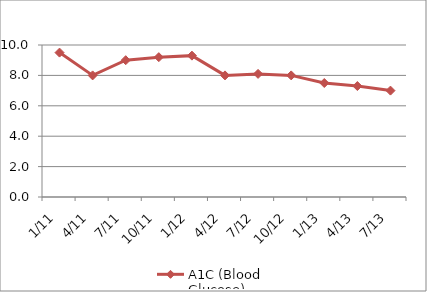
| Category | A1C (Blood Glucose) |
|---|---|
| 1/11 | 9.5 |
| 4/11 | 8 |
| 7/11 | 9 |
| 10/11 | 9.2 |
| 1/12 | 9.3 |
| 4/12 | 8 |
| 7/12 | 8.1 |
| 10/12 | 8 |
| 1/13 | 7.5 |
| 4/13 | 7.3 |
| 7/13 | 7 |